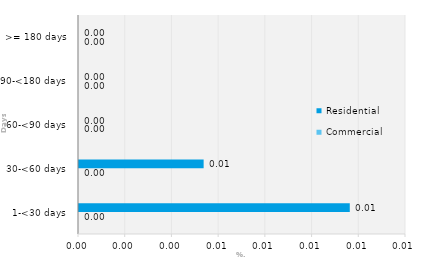
| Category | Commercial | Residential |
|---|---|---|
| 1-<30 days | 0 | 0.012 |
| 30-<60 days | 0 | 0.005 |
| 60-<90 days | 0 | 0 |
| 90-<180 days | 0 | 0 |
| >= 180 days | 0 | 0 |